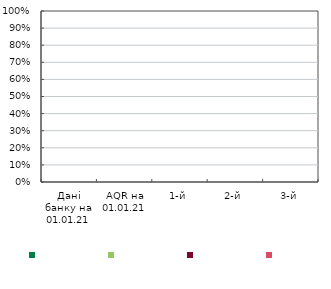
| Category | Series 0 | Series 1 | Series 2 | Series 3 |
|---|---|---|---|---|
| Дані банку на 01.01.21 | 0 | 0 | 0 | 0 |
| AQR на 01.01.21 | 0 | 0 | 0 | 0 |
| 1-й | 0 | 0 | 0 | 0 |
| 2-й | 0 | 0 | 0 | 0 |
| 3-й | 0 | 0 | 0 | 0 |